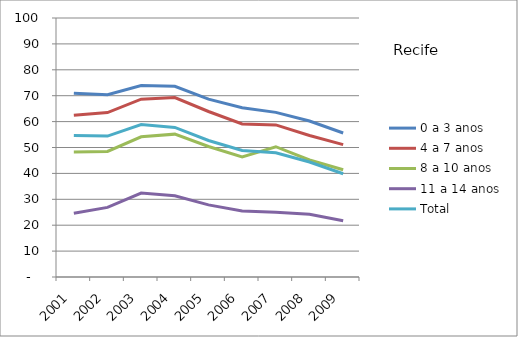
| Category | 0 a 3 anos | 4 a 7 anos | 8 a 10 anos | 11 a 14 anos | Total |
|---|---|---|---|---|---|
| 2001.0 | 70.97 | 62.41 | 48.29 | 24.59 | 54.62 |
| 2002.0 | 70.34 | 63.47 | 48.48 | 26.89 | 54.42 |
| 2003.0 | 73.96 | 68.67 | 54.14 | 32.39 | 58.88 |
| 2004.0 | 73.61 | 69.27 | 55.16 | 31.36 | 57.75 |
| 2005.0 | 68.67 | 63.9 | 50.4 | 27.85 | 52.71 |
| 2006.0 | 65.35 | 59.11 | 46.4 | 25.51 | 48.85 |
| 2007.0 | 63.57 | 58.72 | 50.3 | 25.01 | 47.99 |
| 2008.0 | 60.22 | 54.63 | 45.17 | 24.19 | 44.41 |
| 2009.0 | 55.59 | 51.11 | 41.41 | 21.69 | 39.85 |